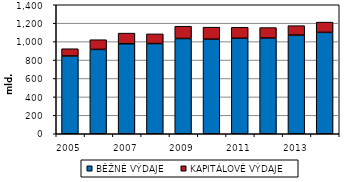
| Category | BĚŽNÉ VÝDAJE | KAPITÁLOVÉ VÝDAJE |
|---|---|---|
| 2005.0 | 843799 | 78999 |
| 2006.0 | 915341 | 105299 |
| 2007.0 | 976748 | 115527 |
| 2008.0 | 978910 | 105034 |
| 2009.0 | 1033845 | 133164 |
| 2010.0 | 1026569 | 130224 |
| 2011.0 | 1036654 | 118872 |
| 2012.0 | 1038764 | 113623 |
| 2013.0 | 1070813 | 102315 |
| 2014.0 | 1100102 | 111507 |